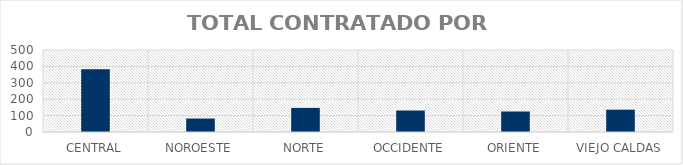
| Category | TOTAL CONTRATADO |
|---|---|
| CENTRAL | 383 |
| NOROESTE | 82 |
| NORTE | 147 |
| OCCIDENTE | 131 |
| ORIENTE | 125 |
| VIEJO CALDAS | 136 |